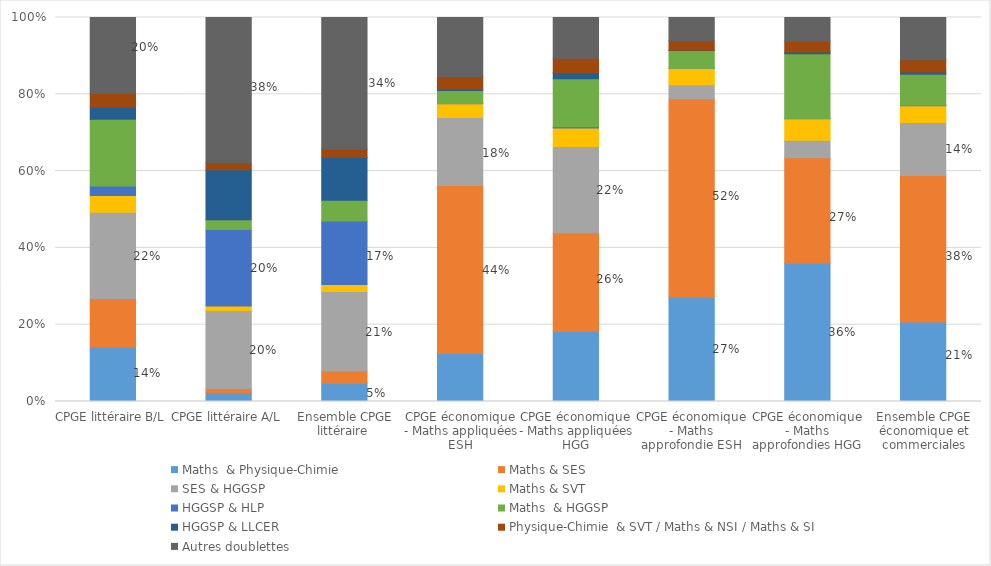
| Category | Maths  & Physique-Chimie  | Maths & SES | SES & HGGSP | Maths & SVT | HGGSP & HLP | Maths  & HGGSP | HGGSP & LLCER | Physique-Chimie  & SVT / Maths & NSI / Maths & SI | Autres doublettes |
|---|---|---|---|---|---|---|---|---|---|
| CPGE littéraire B/L   | 0.142 | 0.126 | 0.225 | 0.044 | 0.025 | 0.174 | 0.032 | 0.035 | 0.198 |
| CPGE littéraire A/L   | 0.024 | 0.01 | 0.203 | 0.012 | 0.199 | 0.025 | 0.13 | 0.018 | 0.379 |
| Ensemble CPGE littéraire  | 0.047 | 0.033 | 0.207 | 0.018 | 0.165 | 0.054 | 0.111 | 0.022 | 0.343 |
| CPGE économique - Maths appliquées ESH | 0.125 | 0.438 | 0.177 | 0.036 | 0.001 | 0.033 | 0.004 | 0.032 | 0.154 |
| CPGE économique - Maths appliquées HGG | 0.182 | 0.257 | 0.224 | 0.049 | 0.003 | 0.125 | 0.016 | 0.038 | 0.106 |
| CPGE économique - Maths approfondie ESH | 0.271 | 0.517 | 0.036 | 0.043 | 0 | 0.046 | 0.001 | 0.025 | 0.06 |
| CPGE économique - Maths approfondies HGG | 0.36 | 0.275 | 0.045 | 0.056 | 0.001 | 0.169 | 0.004 | 0.029 | 0.062 |
| Ensemble CPGE économique et commerciales | 0.207 | 0.381 | 0.138 | 0.044 | 0.001 | 0.081 | 0.006 | 0.032 | 0.11 |